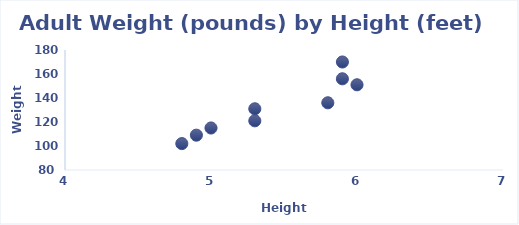
| Category | Weight (pounds) |
|---|---|
| 4.9 | 109 |
| 5.3 | 121 |
| 5.8 | 136 |
| 5.9 | 156 |
| 4.8 | 102 |
| 5.9 | 170 |
| 5.3 | 131 |
| 5.0 | 115 |
| 6.0 | 151 |